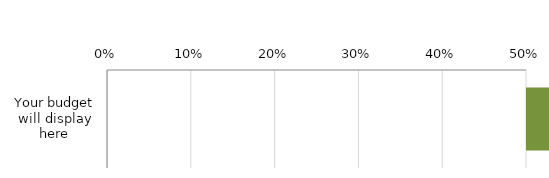
| Category | Series 0 | Series 1 |
|---|---|---|
| Your budget will display here | 0.995 | 0.008 |